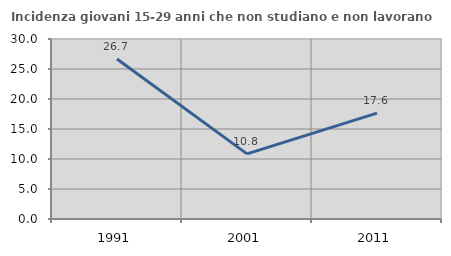
| Category | Incidenza giovani 15-29 anni che non studiano e non lavorano  |
|---|---|
| 1991.0 | 26.667 |
| 2001.0 | 10.849 |
| 2011.0 | 17.647 |